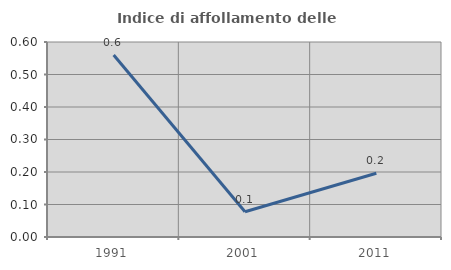
| Category | Indice di affollamento delle abitazioni  |
|---|---|
| 1991.0 | 0.56 |
| 2001.0 | 0.078 |
| 2011.0 | 0.196 |